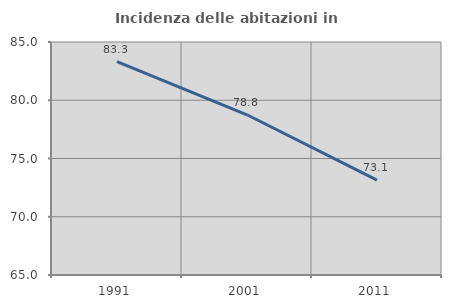
| Category | Incidenza delle abitazioni in proprietà  |
|---|---|
| 1991.0 | 83.307 |
| 2001.0 | 78.754 |
| 2011.0 | 73.139 |